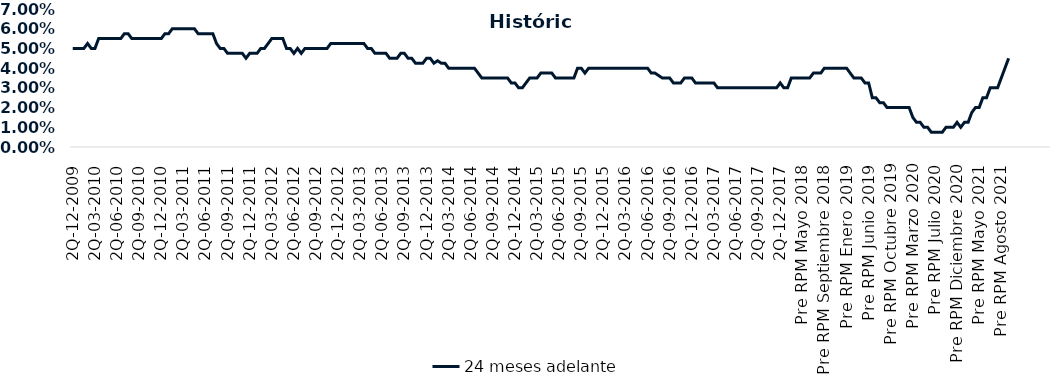
| Category | 24 meses adelante  |
|---|---|
| 2Q-12-2009 | 0.05 |
| 1Q-01-2010 | 0.05 |
| 2Q-01-2010 | 0.05 |
| 1Q-02-2010 | 0.05 |
| 2Q-02-2010 | 0.052 |
| 1Q-03-2010 | 0.05 |
| 2Q-03-2010 | 0.05 |
| 1Q-04-2010 | 0.055 |
| 2Q-04-2010 | 0.055 |
| 1Q-05-2010 | 0.055 |
| 2Q-05-2010 | 0.055 |
| 1Q-06-2010 | 0.055 |
| 2Q-06-2010 | 0.055 |
| 1Q-07-2010 | 0.055 |
| 2Q-07-2010 | 0.058 |
| 1Q-08-2010 | 0.058 |
| 2Q-08-2010 | 0.055 |
| 1Q-09-2010 | 0.055 |
| 2Q-09-2010 | 0.055 |
| 1Q-10-2010 | 0.055 |
| 2Q-10-2010 | 0.055 |
| 1Q-11-2010 | 0.055 |
| 2Q-11-2010 | 0.055 |
| 1Q-12-2010 | 0.055 |
| 2Q-12-2010 | 0.055 |
| 1Q-01-2011 | 0.058 |
| 2Q-01-2011 | 0.058 |
| 1Q-02-2011 | 0.06 |
| 2Q-02-2011 | 0.06 |
| 1Q-03-2011 | 0.06 |
| 2Q-03-2011 | 0.06 |
| 1Q-04-2011 | 0.06 |
| 2Q-04-2011 | 0.06 |
| 1Q-05-2011 | 0.06 |
| 2Q-05-2011 | 0.058 |
| 1Q-06-2011 | 0.058 |
| 2Q-06-2011 | 0.058 |
| 1Q-07-2011 | 0.058 |
| 2Q-07-2011 | 0.058 |
| 1Q-08-2011 | 0.052 |
| 2Q-08-2011 | 0.05 |
| 1Q-09-2011 | 0.05 |
| 2Q-09-2011 | 0.048 |
| 1Q-10-2011 | 0.048 |
| 2Q-10-2011 | 0.048 |
| 1Q-11-2011 | 0.048 |
| 2Q-11-2011 | 0.048 |
| 1Q-12-2011 | 0.045 |
| 2Q-12-2011 | 0.048 |
| 1Q-01-2012 | 0.048 |
| 2Q-01-2012 | 0.048 |
| 1Q-02-2012 | 0.05 |
| 2Q-02-2012 | 0.05 |
| 1Q-03-2012 | 0.052 |
| 2Q-03-2012 | 0.055 |
| 1Q-04-2012 | 0.055 |
| 2Q-04-2012 | 0.055 |
| 1Q-05-2012 | 0.055 |
| 2Q-05-2012 | 0.05 |
| 1Q-06-2012 | 0.05 |
| 2Q-06-2012 | 0.048 |
| 1Q-07-2012 | 0.05 |
| 2Q-07-2012 | 0.048 |
| 1Q-08-2012 | 0.05 |
| 2Q-08-2012 | 0.05 |
| 1Q-09-2012 | 0.05 |
| 2Q-09-2012 | 0.05 |
| 1Q-10-2012 | 0.05 |
| 2Q-10-2012 | 0.05 |
| 1Q-11-2012 | 0.05 |
| 2Q-11-2012 | 0.052 |
| 1Q-12-2012 | 0.052 |
| 2Q-12-2012 | 0.052 |
| 1Q-01-2013 | 0.052 |
| 2Q-01-2013 | 0.052 |
| 1Q-02-2013 | 0.052 |
| 2Q-02-2013 | 0.052 |
| 1Q-03-2013 | 0.052 |
| 2Q-03-2013 | 0.052 |
| 1Q-04-2013 | 0.052 |
| 2Q-04-2013 | 0.05 |
| 1Q-05-2013 | 0.05 |
| 2Q-05-2013 | 0.048 |
| 1Q-06-2013 | 0.048 |
| 2Q-06-2013 | 0.048 |
| 1Q-07-2013 | 0.048 |
| 2Q-07-2013 | 0.045 |
| 1Q-08-2013 | 0.045 |
| 2Q-08-2013 | 0.045 |
| 1Q-09-2013 | 0.048 |
| 2Q-09-2013 | 0.048 |
| 1Q-10-2013 | 0.045 |
| 2Q-10-2013 | 0.045 |
| 1Q-11-2013 | 0.042 |
| 2Q-11-2013 | 0.042 |
| 1Q-12-2013 | 0.042 |
| 2Q-12-2013 | 0.045 |
| 1Q-01-2014 | 0.045 |
| 2Q-01-2014 | 0.042 |
| 1Q-02-2014 | 0.044 |
| 2Q-02-2014 | 0.042 |
| 1Q-03-2014 | 0.042 |
| 2Q-03-2014 | 0.04 |
| 1Q-04-2014 | 0.04 |
| 2Q-04-2014 | 0.04 |
| 1Q-05-2014 | 0.04 |
| 2Q-05-2014 | 0.04 |
| 1Q-06-2014 | 0.04 |
| 2Q-06-2014 | 0.04 |
| 1Q-07-2014 | 0.04 |
| 2Q-07-2014 | 0.038 |
| 1Q-08-2014 | 0.035 |
| 2Q-08-2014 | 0.035 |
| 1Q-09-2014 | 0.035 |
| 2Q-09-2014 | 0.035 |
| 1Q-10-2014 | 0.035 |
| 2Q-10-2014 | 0.035 |
| 1Q-11-2014 | 0.035 |
| 2Q-11-2014 | 0.035 |
| 1Q-12-2014 | 0.032 |
| 2Q-12-2014 | 0.032 |
| 1Q-01-2015 | 0.03 |
| 2Q-01-2015 | 0.03 |
| 1Q-02-2015 | 0.032 |
| 2Q-02-2015 | 0.035 |
| 1Q-03-2015 | 0.035 |
| 2Q-03-2015 | 0.035 |
| 1Q-04-2015 | 0.038 |
| 2Q-04-2015 | 0.038 |
| 1Q-05-2015 | 0.038 |
| 2Q-05-2015 | 0.038 |
| 1Q-06-2015 | 0.035 |
| 2Q-06-2015 | 0.035 |
| 1Q-07-2015 | 0.035 |
| 2Q-07-2015 | 0.035 |
| 1Q-08-2015 | 0.035 |
| 2Q-08-2015 | 0.035 |
| 1Q-09-2015 | 0.04 |
| 2Q-09-2015 | 0.04 |
| 1Q-10-2015 | 0.038 |
| 2Q-10-2015 | 0.04 |
| 1Q-11-2015 | 0.04 |
| 2Q-11-2015 | 0.04 |
| 1Q-12-2015 | 0.04 |
| 2Q-12-2015 | 0.04 |
| 1Q-01-2016 | 0.04 |
| 2Q-01-2016 | 0.04 |
| 1Q-02-2016 | 0.04 |
| 2Q-02-2016 | 0.04 |
| 1Q-03-2016 | 0.04 |
| 2Q-03-2016 | 0.04 |
| 1Q-04-2016 | 0.04 |
| 2Q-04-2016 | 0.04 |
| 1Q-05-2016 | 0.04 |
| 2Q-05-2016 | 0.04 |
| 1Q-06-2016 | 0.04 |
| 2Q-06-2016 | 0.04 |
| 1Q-07-2016 | 0.038 |
| 2Q-07-2016 | 0.038 |
| 1Q-08-2016 | 0.036 |
| 2Q-08-2016 | 0.035 |
| 1Q-09-2016 | 0.035 |
| 2Q-09-2016 | 0.035 |
| 1Q-10-2016 | 0.032 |
| 2Q-10-2016 | 0.032 |
| 1Q-11-2016 | 0.032 |
| 2Q-11-2016 | 0.035 |
| 1Q-12-2016 | 0.035 |
| 2Q-12-2016 | 0.035 |
| 1Q-01-2017 | 0.032 |
| 2Q-01-2017 | 0.032 |
| 1Q-02-2017 | 0.032 |
| 2Q-02-2017 | 0.032 |
| 1Q-03-2017 | 0.032 |
| 2Q-03-2017 | 0.032 |
| 1Q-04-2017 | 0.03 |
| 2Q-04-2017 | 0.03 |
| 1Q-05-2017 | 0.03 |
| 2Q-05-2017 | 0.03 |
| 1Q-06-2017 | 0.03 |
| 2Q-06-2017 | 0.03 |
| 1Q-07-2017 | 0.03 |
| 2Q-07-2017 | 0.03 |
| 1Q-08-2017 | 0.03 |
| 2Q-08-2017 | 0.03 |
| 1Q-09-2017 | 0.03 |
| 2Q-09-2017 | 0.03 |
| 1Q-10-2017 | 0.03 |
| 2Q-10-2017 | 0.03 |
| 1Q-11-2017 | 0.03 |
| 2Q-11-2017 | 0.03 |
| 1Q-12-2017 | 0.03 |
| 2Q-12-2017 | 0.032 |
| 1Q-01-2018 | 0.03 |
| 2Q-01-2018 | 0.03 |
| Post RPM Febrero 2018 | 0.035 |
| Pre RPM Marzo 2018 | 0.035 |
| Post RPM Marzo 2018 | 0.035 |
| Pre RPM Mayo 2018 | 0.035 |
| Post RPM Mayo 2018 | 0.035 |
| Pre RPM Junio 2018 | 0.035 |
| Post RPM Junio 2018 | 0.038 |
| Pre RPM Julio 2018 | 0.038 |
| Post RPM Julio 2018 | 0.038 |
| Pre RPM Septiembre 2018 | 0.04 |
| Post RPM Septiembre 2018 | 0.04 |
| Pre RPM Octubre 2018 | 0.04 |
| Post RPM Octubre 2018 | 0.04 |
| Pre RPM Diciembre 2018 | 0.04 |
| Post RPM Diciembre 2018 | 0.04 |
| Pre RPM Enero 2019 | 0.04 |
| Post RPM Enero 2019 | 0.038 |
| Pre RPM Marzo 2019 | 0.035 |
| Post RPM Marzo 2019 | 0.035 |
| Pre RPM Mayo 2019 | 0.035 |
| Post RPM Mayo 2019 | 0.032 |
| Pre RPM Junio 2019 | 0.032 |
| Post RPM Junio 2019 | 0.025 |
| Pre RPM Julio 2019 | 0.025 |
| Post RPM Julio 2019 | 0.022 |
| Pre RPM Septiembre 2019 | 0.022 |
| Post RPM Septiembre 2019 | 0.02 |
| Pre RPM Octubre 2019 | 0.02 |
| Post RPM Octubre 2019 | 0.02 |
| Pre RPM Diciembre 2019 | 0.02 |
| Post RPM Diciembre 2019 | 0.02 |
| Pre RPM Enero 2020 | 0.02 |
| Post RPM Enero 2020 | 0.02 |
| Pre RPM Marzo 2020 | 0.015 |
| Post RPM Marzo 2020 | 0.012 |
| Pre RPM Mayo 2020 | 0.012 |
| Post RPM Mayo 2020 | 0.01 |
| Pre RPM Junio 2020 | 0.01 |
| Post RPM Junio 2020 | 0.008 |
| Pre RPM Julio 2020 | 0.008 |
| Post RPM Julio 2020 | 0.008 |
| Pre RPM Septiembre 2020 | 0.008 |
| Post RPM Septiembre 2020 | 0.01 |
| Pre RPM Octubre 2020 | 0.01 |
| Post RPM Octubre 2020 | 0.01 |
| Pre RPM Diciembre 2020 | 0.012 |
| Post RPM Diciembre 2020 | 0.01 |
| Pre RPM Enero 2021 | 0.012 |
| Post RPM Enero 2021 | 0.012 |
| Pre RPM Marzo 2021 | 0.018 |
| Post RPM Marzo 2021 | 0.02 |
| Pre RPM Mayo 2021 | 0.02 |
| Post RPM Mayo 2021 | 0.025 |
| Pre RPM Junio 2021 | 0.025 |
| Post RPM Junio 2021 | 0.03 |
| Pre RPM Julio 2021 | 0.03 |
| Post RPM Julio 2021 | 0.03 |
| Pre RPM Agosto 2021 | 0.035 |
| Post RPM Agosto 2021 | 0.04 |
| Pre RPM Octubre 2021 | 0.045 |